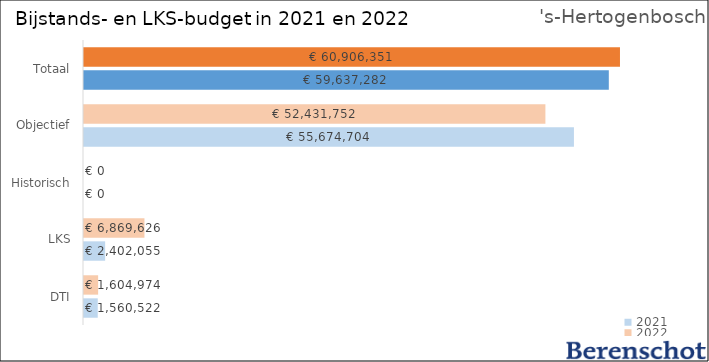
| Category | 2021 | 2022 |
|---|---|---|
| DTI | 1560522.135 | 1604974.025 |
| LKS | 2402054.635 | 6869625.867 |
| Historisch | 0 | 0 |
| Objectief | 55674703.868 | 52431751.539 |
| Totaal | 59637281.62 | 60906351.431 |